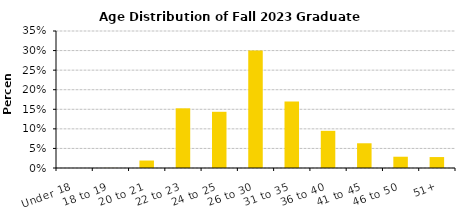
| Category | Series 0 |
|---|---|
| Under 18 | 0 |
| 18 to 19 | 0 |
| 20 to 21 | 0.019 |
| 22 to 23 | 0.152 |
| 24 to 25 | 0.144 |
| 26 to 30 | 0.3 |
| 31 to 35 | 0.17 |
| 36 to 40 | 0.095 |
| 41 to 45 | 0.063 |
| 46 to 50 | 0.029 |
| 51+ | 0.028 |